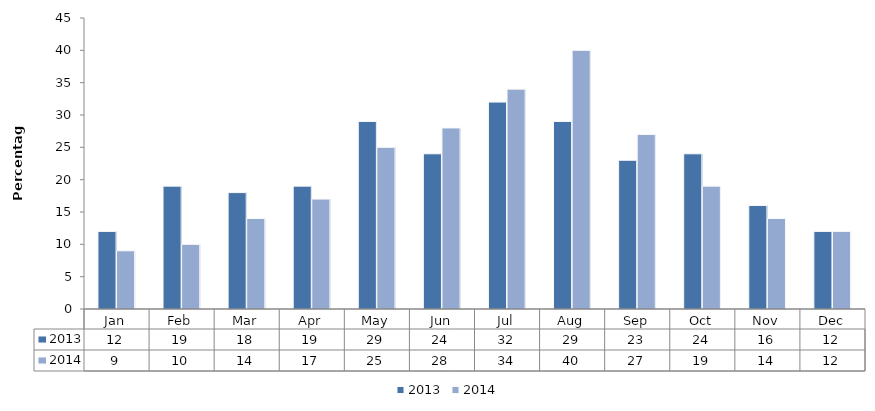
| Category | 2013 | 2014 |
|---|---|---|
| Jan | 12 | 9 |
| Feb | 19 | 10 |
| Mar | 18 | 14 |
| Apr | 19 | 17 |
| May | 29 | 25 |
| Jun | 24 | 28 |
| Jul | 32 | 34 |
| Aug | 29 | 40 |
| Sep | 23 | 27 |
| Oct | 24 | 19 |
| Nov | 16 | 14 |
| Dec | 12 | 12 |